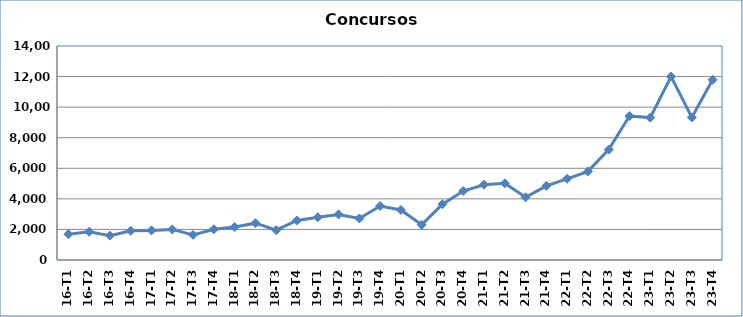
| Category | Series 0 |
|---|---|
| 16-T1 | 1689 |
| 16-T2 | 1847 |
| 16-T3 | 1593 |
| 16-T4 | 1911 |
| 17-T1 | 1937 |
| 17-T2 | 2001 |
| 17-T3 | 1645 |
| 17-T4 | 2011 |
| 18-T1 | 2162 |
| 18-T2 | 2410 |
| 18-T3 | 1953 |
| 18-T4 | 2590 |
| 19-T1 | 2796 |
| 19-T2 | 2982 |
| 19-T3 | 2719 |
| 19-T4 | 3534 |
| 20-T1 | 3274 |
| 20-T2 | 2305 |
| 20-T3 | 3649 |
| 20-T4 | 4513 |
| 21-T1 | 4925 |
| 21-T2 | 5017 |
| 21-T3 | 4101 |
| 21-T4 | 4849 |
| 22-T1 | 5312 |
| 22-T2 | 5798 |
| 22-T3 | 7225 |
| 22-T4 | 9416 |
| 23-T1 | 9316 |
| 23-T2 | 12006 |
| 23-T3 | 9330 |
| 23-T4 | 11791 |